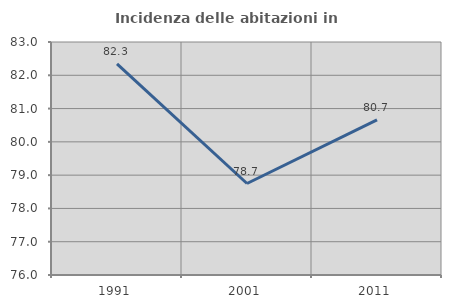
| Category | Incidenza delle abitazioni in proprietà  |
|---|---|
| 1991.0 | 82.34 |
| 2001.0 | 78.749 |
| 2011.0 | 80.658 |